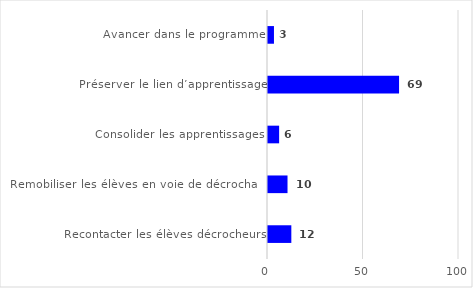
| Category | Series 0 |
|---|---|
| Avancer dans le programme | 3.123 |
| Préserver le lien d’apprentissage | 68.618 |
| Consolider les apprentissages | 5.827 |
| Remobiliser les élèves en voie de décrochage | 10.217 |
| Recontacter les élèves décrocheurs | 12.216 |